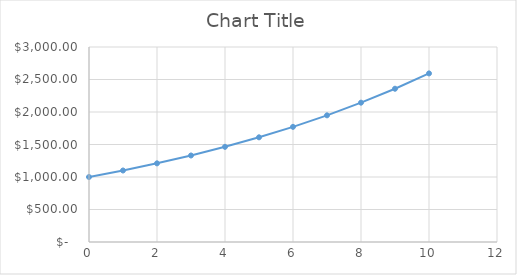
| Category | Series 0 |
|---|---|
| 0.0 | 1000 |
| 1.0 | 1100 |
| 2.0 | 1210 |
| 3.0 | 1331 |
| 4.0 | 1464.1 |
| 5.0 | 1610.51 |
| 6.0 | 1771.561 |
| 7.0 | 1948.717 |
| 8.0 | 2143.589 |
| 9.0 | 2357.948 |
| 10.0 | 2593.742 |